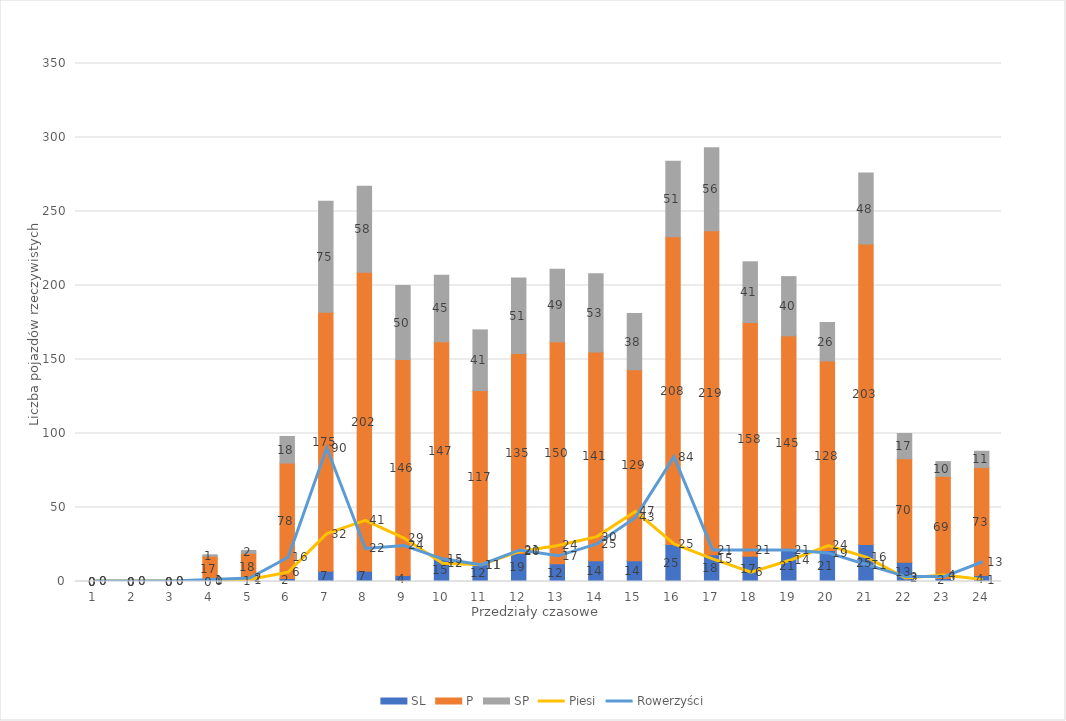
| Category | SL | P | SP |
|---|---|---|---|
| 0 | 0 | 0 | 0 |
| 1 | 0 | 0 | 0 |
| 2 | 0 | 0 | 0 |
| 3 | 0 | 17 | 1 |
| 4 | 1 | 18 | 2 |
| 5 | 2 | 78 | 18 |
| 6 | 7 | 175 | 75 |
| 7 | 7 | 202 | 58 |
| 8 | 4 | 146 | 50 |
| 9 | 15 | 147 | 45 |
| 10 | 12 | 117 | 41 |
| 11 | 19 | 135 | 51 |
| 12 | 12 | 150 | 49 |
| 13 | 14 | 141 | 53 |
| 14 | 14 | 129 | 38 |
| 15 | 25 | 208 | 51 |
| 16 | 18 | 219 | 56 |
| 17 | 17 | 158 | 41 |
| 18 | 21 | 145 | 40 |
| 19 | 21 | 128 | 26 |
| 20 | 25 | 203 | 48 |
| 21 | 13 | 70 | 17 |
| 22 | 2 | 69 | 10 |
| 23 | 4 | 73 | 11 |